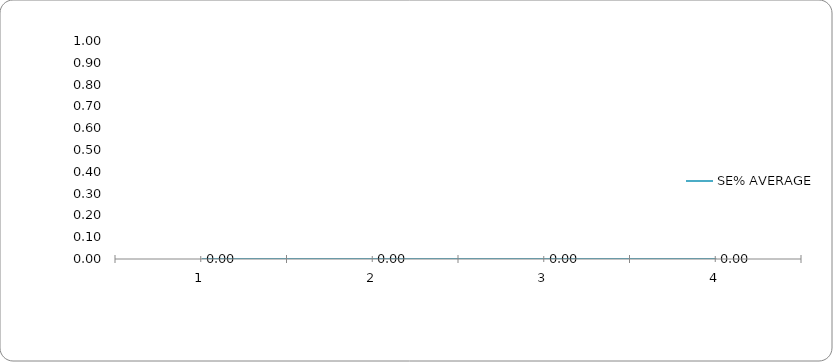
| Category | SE% AVERAGE |
|---|---|
| 0 | 0 |
| 1 | 0 |
| 2 | 0 |
| 3 | 0 |